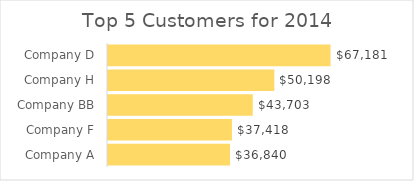
| Category | Total |
|---|---|
| Company D | 67180.5 |
| Company H | 50198.35 |
| Company BB | 43703 |
| Company F | 37418 |
| Company A | 36839.99 |